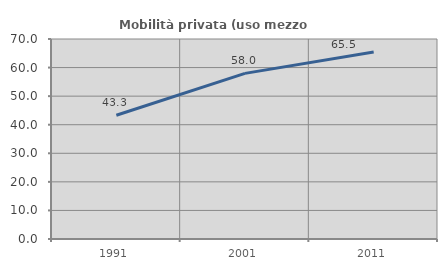
| Category | Mobilità privata (uso mezzo privato) |
|---|---|
| 1991.0 | 43.316 |
| 2001.0 | 57.968 |
| 2011.0 | 65.469 |